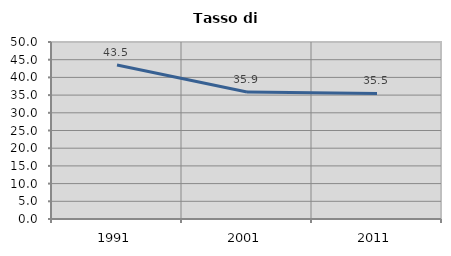
| Category | Tasso di disoccupazione   |
|---|---|
| 1991.0 | 43.494 |
| 2001.0 | 35.897 |
| 2011.0 | 35.458 |